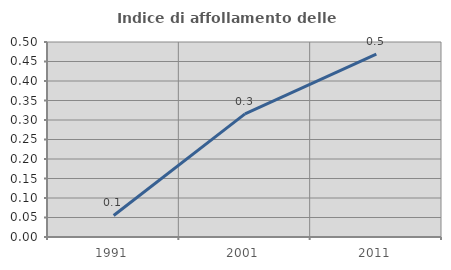
| Category | Indice di affollamento delle abitazioni  |
|---|---|
| 1991.0 | 0.055 |
| 2001.0 | 0.316 |
| 2011.0 | 0.469 |